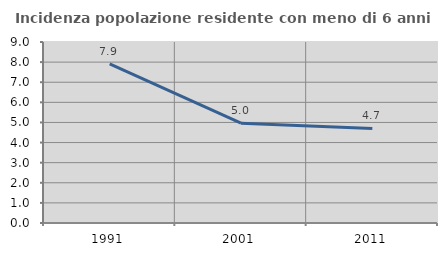
| Category | Incidenza popolazione residente con meno di 6 anni |
|---|---|
| 1991.0 | 7.912 |
| 2001.0 | 4.964 |
| 2011.0 | 4.701 |